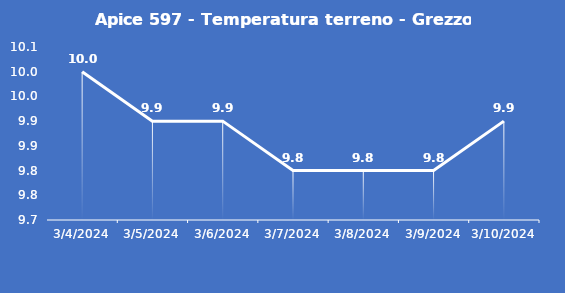
| Category | Apice 597 - Temperatura terreno - Grezzo (°C) |
|---|---|
| 3/4/24 | 10 |
| 3/5/24 | 9.9 |
| 3/6/24 | 9.9 |
| 3/7/24 | 9.8 |
| 3/8/24 | 9.8 |
| 3/9/24 | 9.8 |
| 3/10/24 | 9.9 |